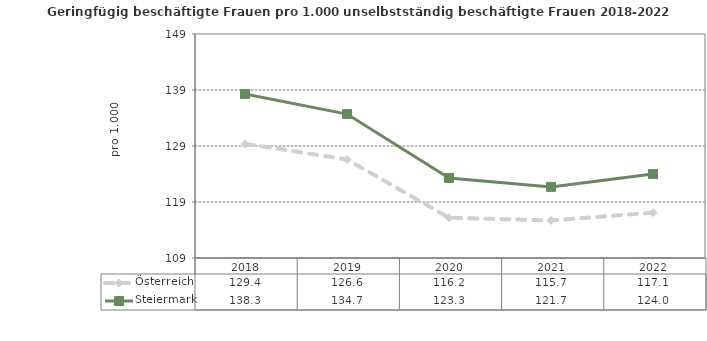
| Category | Österreich | Steiermark |
|---|---|---|
| 2022.0 | 117.1 | 124 |
| 2021.0 | 115.7 | 121.7 |
| 2020.0 | 116.2 | 123.3 |
| 2019.0 | 126.6 | 134.7 |
| 2018.0 | 129.4 | 138.3 |